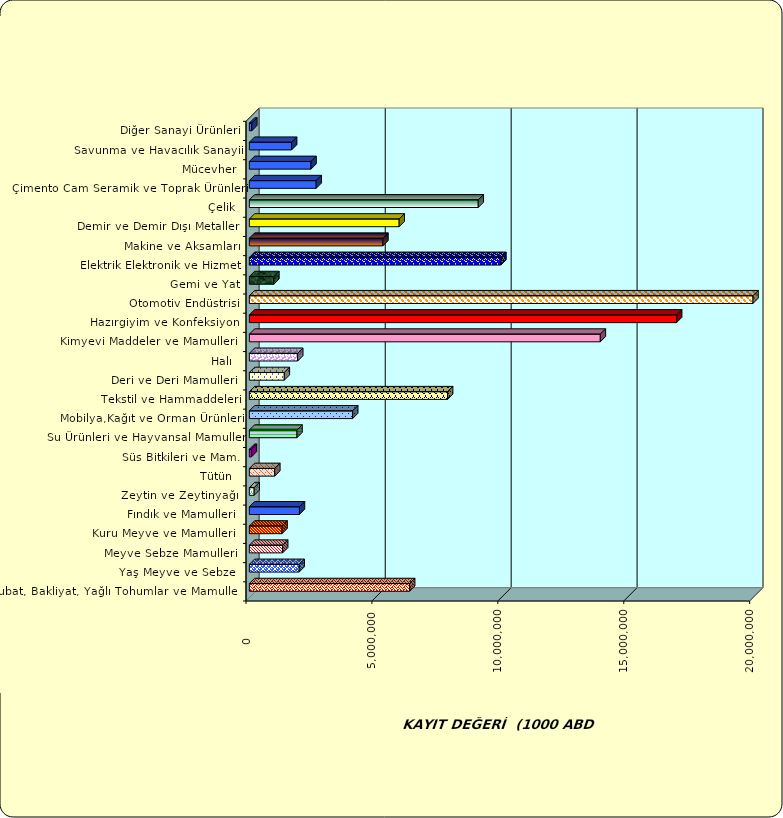
| Category | Series 0 |
|---|---|
|  Hububat, Bakliyat, Yağlı Tohumlar ve Mamulleri  | 6364110.621 |
|  Yaş Meyve ve Sebze   | 1979078.939 |
|  Meyve Sebze Mamulleri  | 1322331.618 |
|  Kuru Meyve ve Mamulleri   | 1298657.182 |
|  Fındık ve Mamulleri  | 1988345.937 |
|  Zeytin ve Zeytinyağı  | 190885.497 |
|  Tütün  | 1010330.432 |
|  Süs Bitkileri ve Mam. | 81356.915 |
|  Su Ürünleri ve Hayvansal Mamuller | 1891071.518 |
|  Mobilya,Kağıt ve Orman Ürünleri | 4102998.65 |
|  Tekstil ve Hammaddeleri | 7871654.339 |
|  Deri ve Deri Mamulleri  | 1388614.655 |
|  Halı  | 1920302.592 |
|  Kimyevi Maddeler ve Mamulleri   | 13936293.72 |
|  Hazırgiyim ve Konfeksiyon  | 16965859.061 |
|  Otomotiv Endüstrisi | 23889626.102 |
|  Gemi ve Yat | 972176.852 |
|  Elektrik Elektronik ve Hizmet | 9987737.126 |
|  Makine ve Aksamları | 5303014.227 |
|  Demir ve Demir Dışı Metaller  | 5948965.535 |
|  Çelik | 9089330.125 |
|  Çimento Cam Seramik ve Toprak Ürünleri | 2654696.03 |
|  Mücevher | 2448674.14 |
|  Savunma ve Havacılık Sanayii | 1677512.77 |
|  Diğer Sanayi Ürünleri | 96636.947 |